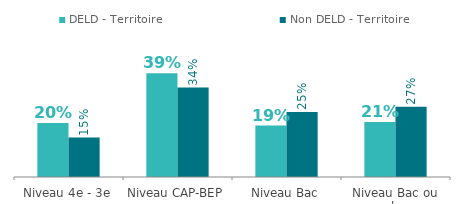
| Category | DELD - Territoire | Non DELD - Territoire |
|---|---|---|
| Niveau 4e - 3e | 0.204 | 0.149 |
| Niveau CAP-BEP | 0.393 | 0.339 |
| Niveau Bac | 0.195 | 0.246 |
| Niveau Bac ou plus | 0.208 | 0.266 |